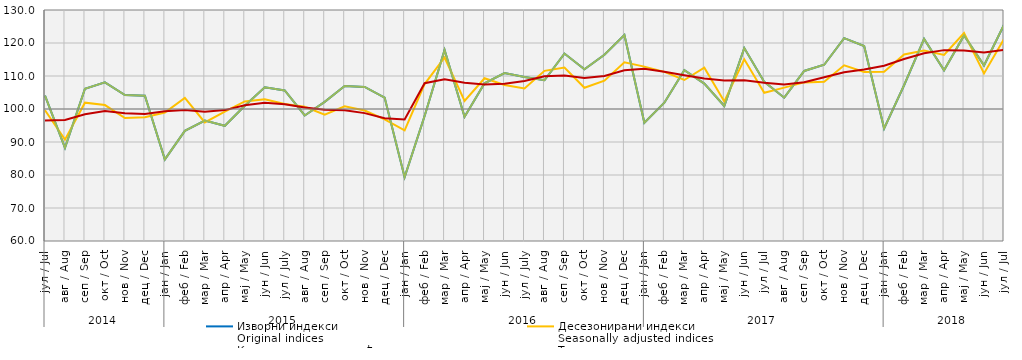
| Category | Изворни индекси
Original indices | Десезонирани индекси
Seasonally adjusted indices | Календарски прилагођени индекси
Working-day adjusted indices | Тренд
Trend |
|---|---|---|---|---|
| 0 | 104.036 | 99.623 | 104.036 | 96.551 |
| 1 | 88.225 | 90.706 | 88.225 | 96.696 |
| 2 | 106.132 | 101.91 | 106.132 | 98.419 |
| 3 | 108.074 | 101.199 | 108.074 | 99.384 |
| 4 | 104.242 | 97.277 | 104.242 | 98.696 |
| 5 | 104.032 | 97.505 | 104.032 | 98.458 |
| 6 | 84.716 | 98.938 | 84.716 | 99.323 |
| 7 | 93.365 | 103.349 | 93.365 | 99.724 |
| 8 | 96.491 | 95.944 | 96.491 | 99.174 |
| 9 | 94.914 | 99.238 | 94.914 | 99.668 |
| 10 | 101.001 | 102.308 | 101.001 | 101.164 |
| 11 | 106.571 | 102.92 | 106.571 | 101.903 |
| 12 | 105.634 | 101.511 | 105.634 | 101.428 |
| 13 | 98.032 | 100.688 | 98.032 | 100.429 |
| 14 | 102.175 | 98.254 | 102.175 | 99.797 |
| 15 | 106.973 | 100.806 | 106.973 | 99.613 |
| 16 | 106.679 | 99.554 | 106.679 | 98.749 |
| 17 | 103.448 | 96.83 | 103.448 | 97.195 |
| 18 | 79.358 | 93.522 | 79.358 | 96.817 |
| 19 | 97.898 | 107.551 | 97.898 | 107.805 |
| 20 | 117.913 | 115.607 | 117.913 | 108.995 |
| 21 | 97.629 | 102.417 | 97.629 | 107.987 |
| 22 | 107.793 | 109.325 | 107.793 | 107.43 |
| 23 | 110.869 | 107.275 | 110.869 | 107.644 |
| 24 | 109.684 | 106.207 | 109.684 | 108.464 |
| 25 | 108.719 | 111.556 | 108.719 | 109.893 |
| 26 | 116.799 | 112.549 | 116.799 | 110.14 |
| 27 | 112.011 | 106.428 | 112.011 | 109.38 |
| 28 | 116.451 | 108.579 | 116.451 | 110.026 |
| 29 | 122.432 | 114.147 | 122.432 | 111.718 |
| 30 | 95.812 | 112.838 | 95.812 | 112.213 |
| 31 | 101.907 | 111.258 | 101.907 | 111.304 |
| 32 | 111.746 | 108.789 | 111.746 | 110.259 |
| 33 | 107.7 | 112.526 | 107.7 | 109.229 |
| 34 | 100.901 | 102.287 | 100.901 | 108.601 |
| 35 | 118.466 | 115.075 | 118.466 | 108.735 |
| 36 | 108.212 | 104.932 | 108.212 | 107.99 |
| 37 | 103.433 | 106.474 | 103.433 | 107.389 |
| 38 | 111.521 | 108.06 | 111.521 | 108.124 |
| 39 | 113.414 | 108.27 | 113.414 | 109.643 |
| 40 | 121.479 | 113.23 | 121.479 | 111.161 |
| 41 | 119.1 | 111.205 | 119.1 | 111.98 |
| 42 | 94.101 | 111.259 | 94.101 | 113.128 |
| 43 | 107.2 | 116.512 | 107.218 | 115.16 |
| 44 | 121.246 | 117.695 | 121.246 | 116.883 |
| 45 | 111.733 | 116.385 | 111.733 | 117.837 |
| 46 | 122.3 | 123.01 | 122.305 | 117.734 |
| 47 | 113.2 | 110.767 | 113.217 | 117.137 |
| 48 | 125.5 | 121.187 | 125.527 | 117.881 |